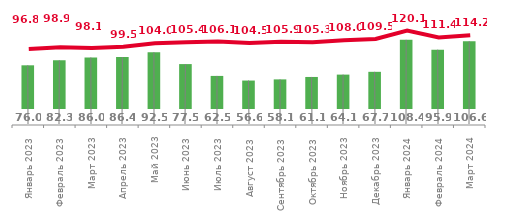
| Category | C |
|---|---|
| Январь 2023 | 75.966 |
| Февраль 2023 | 82.29 |
| Март 2023 | 85.961 |
| Апрель 2023 | 86.447 |
| Май 2023 | 92.525 |
| Июнь 2023 | 77.527 |
| Июль 2023 | 62.468 |
| Август 2023 | 56.578 |
| Сентябрь 2023 | 58.054 |
| Октябрь 2023 | 61.141 |
| Ноябрь 2023 | 64.138 |
| Декабрь 2023 | 67.678 |
| Январь 2024 | 108.402 |
| Февраль 2024 | 95.873 |
| Март 2024 | 106.594 |